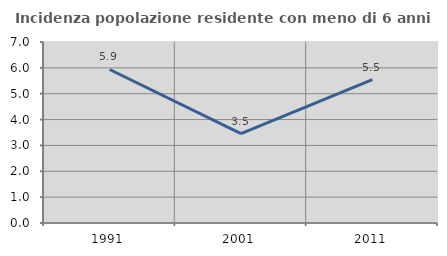
| Category | Incidenza popolazione residente con meno di 6 anni |
|---|---|
| 1991.0 | 5.937 |
| 2001.0 | 3.456 |
| 2011.0 | 5.546 |